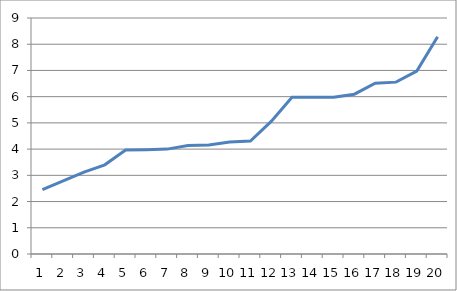
| Category | Duracio anys |
|---|---|
| 0 | 2.459 |
| 1 | 2.793 |
| 2 | 3.121 |
| 3 | 3.4 |
| 4 | 3.964 |
| 5 | 3.978 |
| 6 | 4 |
| 7 | 4.134 |
| 8 | 4.156 |
| 9 | 4.274 |
| 10 | 4.309 |
| 11 | 5.057 |
| 12 | 5.977 |
| 13 | 5.979 |
| 14 | 5.979 |
| 15 | 6.094 |
| 16 | 6.513 |
| 17 | 6.554 |
| 18 | 6.973 |
| 19 | 8.285 |